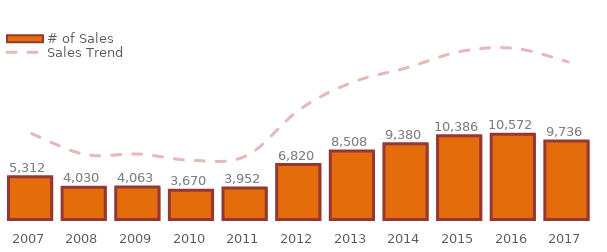
| Category | # of Sales |
|---|---|
| 2007.0 | 5312 |
| 2008.0 | 4030 |
| 2009.0 | 4063 |
| 2010.0 | 3670 |
| 2011.0 | 3952 |
| 2012.0 | 6820 |
| 2013.0 | 8508 |
| 2014.0 | 9380 |
| 2015.0 | 10386 |
| 2016.0 | 10572 |
| 2017.0 | 9736 |